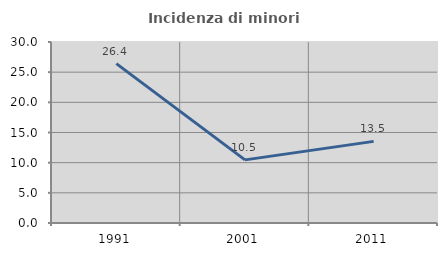
| Category | Incidenza di minori stranieri |
|---|---|
| 1991.0 | 26.415 |
| 2001.0 | 10.465 |
| 2011.0 | 13.529 |